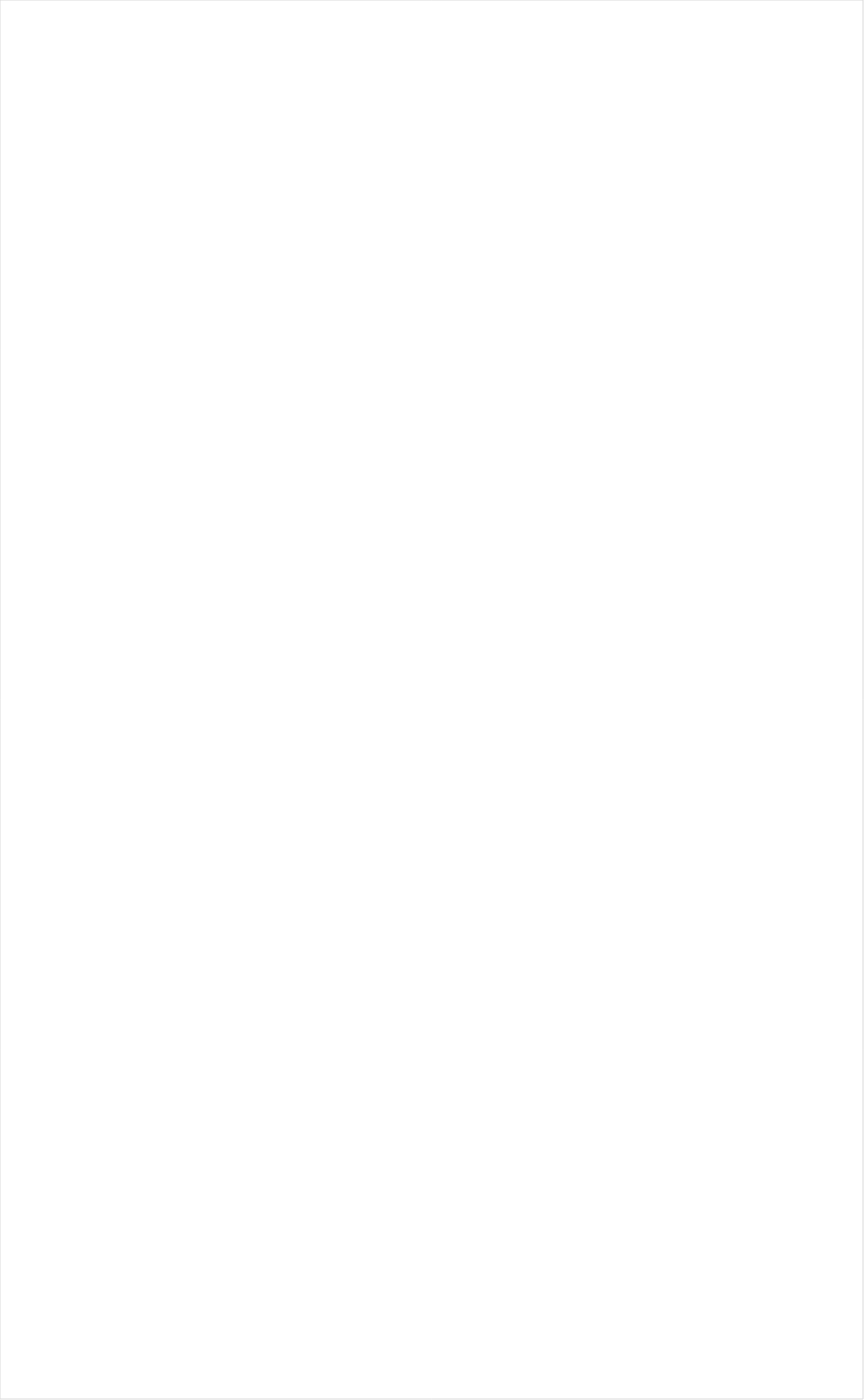
| Category | Total |
|---|---|
| RFD TV | -0.274 |
| Olympic Channel | -0.221 |
| INSP | -0.191 |
| Fox Business | -0.186 |
| PBS | -0.182 |
| Hallmark Movies & Mysteries | -0.181 |
| Tennis Channel | -0.167 |
| MSNBC | -0.167 |
| Smithsonian | -0.14 |
| National Geographic Wild | -0.132 |
| Fox News | -0.13 |
| CBS | -0.126 |
| Science Channel | -0.123 |
| Weather Channel | -0.117 |
| Great American Country | -0.114 |
| Hallmark | -0.111 |
| DIY | -0.109 |
| Reelz Channel | -0.108 |
| NHL | -0.105 |
| CBS Sports | -0.095 |
| American Heroes Channel | -0.094 |
| FYI | -0.091 |
| CNN | -0.089 |
| History Channel | -0.087 |
| UP TV | -0.084 |
| Big Ten Network | -0.084 |
| Bloomberg HD | -0.083 |
| Motor Trend Network | -0.082 |
| CMTV | -0.081 |
| NBC | -0.079 |
| Destination America | -0.079 |
| SundanceTV | -0.079 |
| The Sportsman Channel | -0.078 |
| Headline News | -0.067 |
| Investigation Discovery | -0.065 |
| Game Show | -0.064 |
| HGTV | -0.061 |
| Cooking Channel | -0.06 |
| Outdoor Channel | -0.06 |
| MLB Network | -0.059 |
| WGN America | -0.057 |
| TV LAND | -0.056 |
| ABC | -0.056 |
| National Geographic | -0.054 |
| Ovation | -0.052 |
| Logo | -0.051 |
| Animal Planet | -0.049 |
| NBC Sports | -0.048 |
| POP | -0.048 |
| BBC America | -0.04 |
| ESPNEWS | -0.039 |
| ESPNU | -0.038 |
| AMC | -0.037 |
| Travel | -0.037 |
| Discovery Channel | -0.035 |
| Golf | -0.035 |
| PAC-12 Network | -0.035 |
| CW | -0.034 |
| ION | -0.032 |
| FX Movie Channel | -0.03 |
| FOX | -0.029 |
| Fox Sports 1 | -0.026 |
| NFL Network | -0.02 |
| A&E | -0.019 |
| Independent Film (IFC) | -0.016 |
| Oprah Winfrey Network | -0.014 |
| Food Network | -0.013 |
| MyNetworkTV | -0.008 |
| Discovery Family Channel | -0.008 |
| OXYGEN | -0.003 |
| TLC | -0.003 |
| WE TV | 0.002 |
| Viceland | 0.002 |
| Lifetime | 0.012 |
| BET Her | 0.015 |
| TNT | 0.018 |
| SYFY | 0.021 |
| ESPN2 | 0.024 |
| FXDEP | 0.024 |
| TBS | 0.024 |
| Discovery Life Channel | 0.025 |
| TV ONE | 0.028 |
| CNBC | 0.028 |
| BRAVO | 0.034 |
| Paramount Network | 0.056 |
| USA Network | 0.064 |
| Lifetime Movies | 0.069 |
| ESPN | 0.079 |
| Cartoon Network | 0.083 |
| NBA TV | 0.086 |
| FX | 0.091 |
| E! | 0.096 |
| Comedy Central | 0.102 |
| truTV | 0.105 |
| BET | 0.111 |
| ESPN Deportes | 0.111 |
| FXX | 0.118 |
| Freeform | 0.123 |
| Teen Nick | 0.131 |
| Disney XD | 0.137 |
| Nick@Nite | 0.139 |
| Disney Channel | 0.141 |
| Universal Kids | 0.163 |
| Adult Swim | 0.172 |
| Nick | 0.173 |
| MTV | 0.176 |
| VH1 | 0.178 |
| NBC Universo | 0.183 |
| Nick Toons | 0.185 |
| Univision | 0.2 |
| MTV2 | 0.2 |
| Telemundo | 0.208 |
| UniMas | 0.233 |
| Galavision | 0.251 |
| TUDN | 0.27 |
| Nick Jr. | 0.317 |
| Disney Junior US | 0.318 |